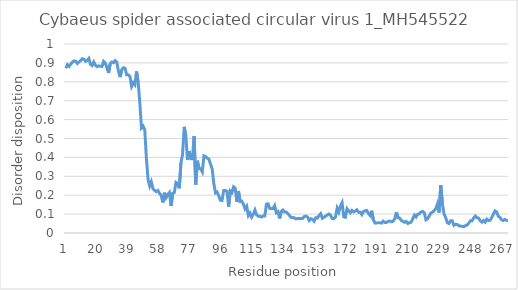
| Category | Series 0 |
|---|---|
| 0 | 0.872 |
| 1 | 0.891 |
| 2 | 0.881 |
| 3 | 0.894 |
| 4 | 0.904 |
| 5 | 0.911 |
| 6 | 0.909 |
| 7 | 0.897 |
| 8 | 0.905 |
| 9 | 0.911 |
| 10 | 0.922 |
| 11 | 0.92 |
| 12 | 0.908 |
| 13 | 0.914 |
| 14 | 0.924 |
| 15 | 0.892 |
| 16 | 0.886 |
| 17 | 0.905 |
| 18 | 0.888 |
| 19 | 0.88 |
| 20 | 0.884 |
| 21 | 0.882 |
| 22 | 0.881 |
| 23 | 0.908 |
| 24 | 0.9 |
| 25 | 0.873 |
| 26 | 0.847 |
| 27 | 0.897 |
| 28 | 0.905 |
| 29 | 0.901 |
| 30 | 0.912 |
| 31 | 0.904 |
| 32 | 0.856 |
| 33 | 0.825 |
| 34 | 0.864 |
| 35 | 0.874 |
| 36 | 0.872 |
| 37 | 0.837 |
| 38 | 0.837 |
| 39 | 0.829 |
| 40 | 0.776 |
| 41 | 0.795 |
| 42 | 0.784 |
| 43 | 0.855 |
| 44 | 0.796 |
| 45 | 0.689 |
| 46 | 0.556 |
| 47 | 0.566 |
| 48 | 0.546 |
| 49 | 0.395 |
| 50 | 0.284 |
| 51 | 0.249 |
| 52 | 0.271 |
| 53 | 0.234 |
| 54 | 0.225 |
| 55 | 0.219 |
| 56 | 0.225 |
| 57 | 0.21 |
| 58 | 0.199 |
| 59 | 0.161 |
| 60 | 0.213 |
| 61 | 0.187 |
| 62 | 0.204 |
| 63 | 0.214 |
| 64 | 0.143 |
| 65 | 0.21 |
| 66 | 0.215 |
| 67 | 0.268 |
| 68 | 0.262 |
| 69 | 0.237 |
| 70 | 0.371 |
| 71 | 0.416 |
| 72 | 0.562 |
| 73 | 0.511 |
| 74 | 0.387 |
| 75 | 0.434 |
| 76 | 0.393 |
| 77 | 0.393 |
| 78 | 0.514 |
| 79 | 0.256 |
| 80 | 0.382 |
| 81 | 0.341 |
| 82 | 0.34 |
| 83 | 0.324 |
| 84 | 0.408 |
| 85 | 0.405 |
| 86 | 0.396 |
| 87 | 0.391 |
| 88 | 0.364 |
| 89 | 0.34 |
| 90 | 0.262 |
| 91 | 0.212 |
| 92 | 0.217 |
| 93 | 0.196 |
| 94 | 0.173 |
| 95 | 0.172 |
| 96 | 0.225 |
| 97 | 0.225 |
| 98 | 0.221 |
| 99 | 0.139 |
| 100 | 0.222 |
| 101 | 0.214 |
| 102 | 0.244 |
| 103 | 0.238 |
| 104 | 0.165 |
| 105 | 0.222 |
| 106 | 0.167 |
| 107 | 0.168 |
| 108 | 0.152 |
| 109 | 0.127 |
| 110 | 0.141 |
| 111 | 0.092 |
| 112 | 0.105 |
| 113 | 0.084 |
| 114 | 0.099 |
| 115 | 0.122 |
| 116 | 0.097 |
| 117 | 0.089 |
| 118 | 0.089 |
| 119 | 0.085 |
| 120 | 0.09 |
| 121 | 0.09 |
| 122 | 0.153 |
| 123 | 0.154 |
| 124 | 0.13 |
| 125 | 0.13 |
| 126 | 0.13 |
| 127 | 0.145 |
| 128 | 0.107 |
| 129 | 0.113 |
| 130 | 0.077 |
| 131 | 0.113 |
| 132 | 0.122 |
| 133 | 0.112 |
| 134 | 0.112 |
| 135 | 0.103 |
| 136 | 0.093 |
| 137 | 0.082 |
| 138 | 0.082 |
| 139 | 0.08 |
| 140 | 0.074 |
| 141 | 0.077 |
| 142 | 0.077 |
| 143 | 0.077 |
| 144 | 0.077 |
| 145 | 0.087 |
| 146 | 0.089 |
| 147 | 0.085 |
| 148 | 0.066 |
| 149 | 0.075 |
| 150 | 0.072 |
| 151 | 0.062 |
| 152 | 0.081 |
| 153 | 0.079 |
| 154 | 0.093 |
| 155 | 0.102 |
| 156 | 0.078 |
| 157 | 0.083 |
| 158 | 0.09 |
| 159 | 0.095 |
| 160 | 0.101 |
| 161 | 0.094 |
| 162 | 0.076 |
| 163 | 0.076 |
| 164 | 0.085 |
| 165 | 0.131 |
| 166 | 0.111 |
| 167 | 0.144 |
| 168 | 0.161 |
| 169 | 0.086 |
| 170 | 0.083 |
| 171 | 0.129 |
| 172 | 0.118 |
| 173 | 0.107 |
| 174 | 0.119 |
| 175 | 0.112 |
| 176 | 0.116 |
| 177 | 0.123 |
| 178 | 0.11 |
| 179 | 0.11 |
| 180 | 0.097 |
| 181 | 0.114 |
| 182 | 0.118 |
| 183 | 0.119 |
| 184 | 0.103 |
| 185 | 0.093 |
| 186 | 0.118 |
| 187 | 0.07 |
| 188 | 0.053 |
| 189 | 0.053 |
| 190 | 0.054 |
| 191 | 0.054 |
| 192 | 0.052 |
| 193 | 0.063 |
| 194 | 0.056 |
| 195 | 0.056 |
| 196 | 0.062 |
| 197 | 0.063 |
| 198 | 0.059 |
| 199 | 0.062 |
| 200 | 0.074 |
| 201 | 0.11 |
| 202 | 0.081 |
| 203 | 0.079 |
| 204 | 0.066 |
| 205 | 0.062 |
| 206 | 0.056 |
| 207 | 0.061 |
| 208 | 0.05 |
| 209 | 0.055 |
| 210 | 0.057 |
| 211 | 0.075 |
| 212 | 0.095 |
| 213 | 0.085 |
| 214 | 0.099 |
| 215 | 0.102 |
| 216 | 0.111 |
| 217 | 0.115 |
| 218 | 0.107 |
| 219 | 0.07 |
| 220 | 0.075 |
| 221 | 0.09 |
| 222 | 0.106 |
| 223 | 0.11 |
| 224 | 0.118 |
| 225 | 0.13 |
| 226 | 0.154 |
| 227 | 0.108 |
| 228 | 0.253 |
| 229 | 0.154 |
| 230 | 0.1 |
| 231 | 0.081 |
| 232 | 0.054 |
| 233 | 0.05 |
| 234 | 0.065 |
| 235 | 0.065 |
| 236 | 0.04 |
| 237 | 0.046 |
| 238 | 0.045 |
| 239 | 0.038 |
| 240 | 0.037 |
| 241 | 0.036 |
| 242 | 0.034 |
| 243 | 0.039 |
| 244 | 0.042 |
| 245 | 0.052 |
| 246 | 0.065 |
| 247 | 0.065 |
| 248 | 0.079 |
| 249 | 0.09 |
| 250 | 0.081 |
| 251 | 0.079 |
| 252 | 0.065 |
| 253 | 0.058 |
| 254 | 0.066 |
| 255 | 0.058 |
| 256 | 0.073 |
| 257 | 0.066 |
| 258 | 0.068 |
| 259 | 0.082 |
| 260 | 0.1 |
| 261 | 0.117 |
| 262 | 0.111 |
| 263 | 0.088 |
| 264 | 0.083 |
| 265 | 0.07 |
| 266 | 0.066 |
| 267 | 0.072 |
| 268 | 0.067 |
| 269 | 0.065 |